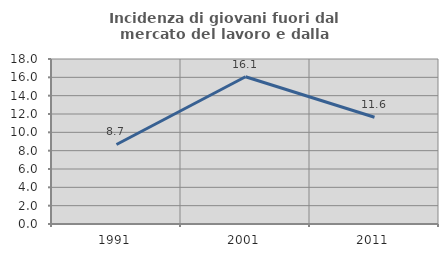
| Category | Incidenza di giovani fuori dal mercato del lavoro e dalla formazione  |
|---|---|
| 1991.0 | 8.675 |
| 2001.0 | 16.068 |
| 2011.0 | 11.648 |